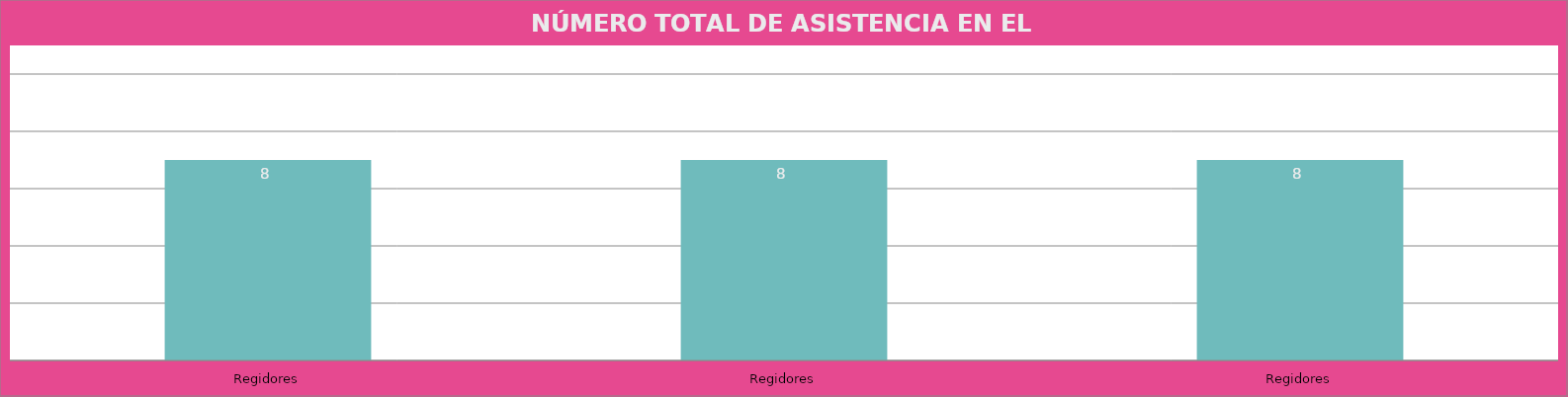
| Category | Regidores |
|---|---|
| Regidores | 8 |
| Regidores | 8 |
| Regidores | 8 |